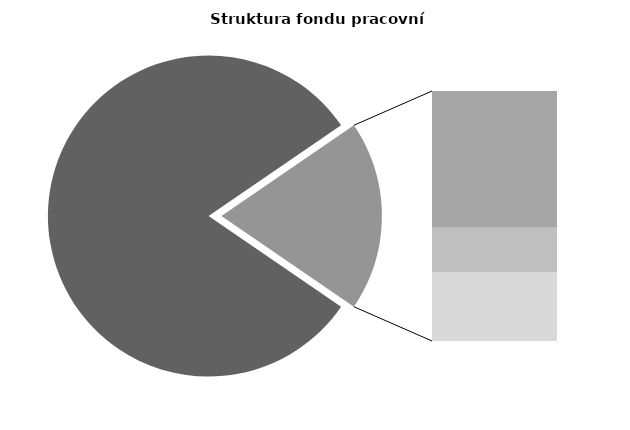
| Category | Series 0 |
|---|---|
| Průměrná měsíční odpracovaná doba bez přesčasu | 138.925 |
| Dovolená | 17.948 |
| Nemoc | 5.806 |
| Jiné | 9.076 |